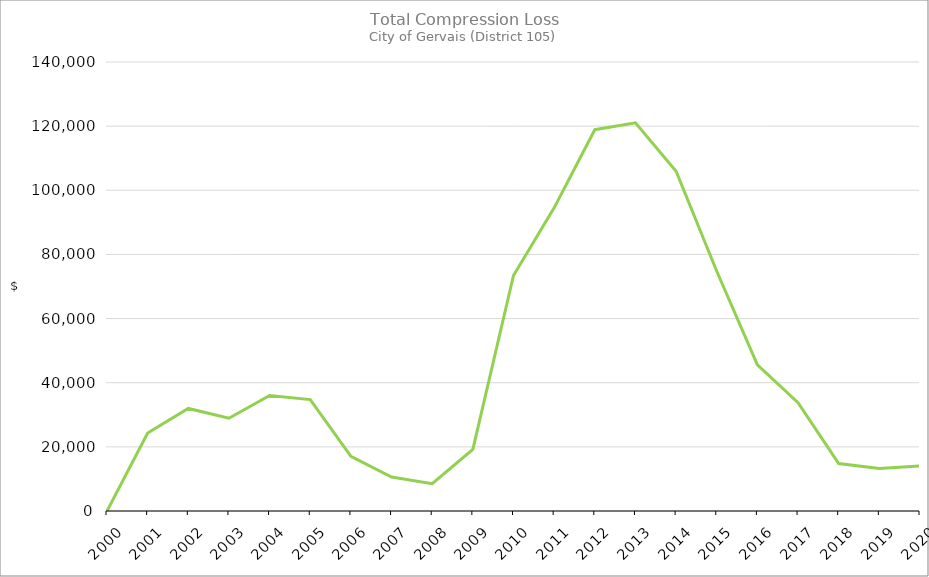
| Category | Series 0 |
|---|---|
| 2000.0 | 0.07 |
| 2001.0 | 24311.63 |
| 2002.0 | 31981.87 |
| 2003.0 | 28933.41 |
| 2004.0 | 36026.91 |
| 2005.0 | 34727.08 |
| 2006.0 | 17070.61 |
| 2007.0 | 10570.18 |
| 2008.0 | 8507.19 |
| 2009.0 | 19193.65 |
| 2010.0 | 73427.3 |
| 2011.0 | 94533.14 |
| 2012.0 | 118886.31 |
| 2013.0 | 121034.63 |
| 2014.0 | 105934.73 |
| 2015.0 | 74750.29 |
| 2016.0 | 45600.23 |
| 2017.0 | 33761.4 |
| 2018.0 | 14799.85 |
| 2019.0 | 13262.95 |
| 2020.0 | 14076.07 |